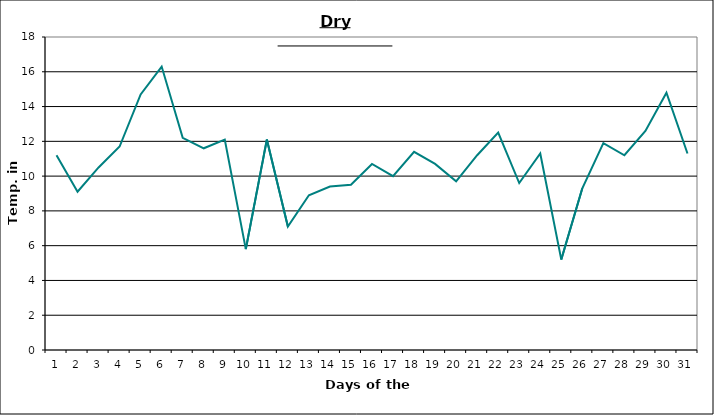
| Category | Series 0 |
|---|---|
| 0 | 11.2 |
| 1 | 9.1 |
| 2 | 10.5 |
| 3 | 11.7 |
| 4 | 14.7 |
| 5 | 16.3 |
| 6 | 12.2 |
| 7 | 11.6 |
| 8 | 12.1 |
| 9 | 5.8 |
| 10 | 12.1 |
| 11 | 7.1 |
| 12 | 8.9 |
| 13 | 9.4 |
| 14 | 9.5 |
| 15 | 10.7 |
| 16 | 10 |
| 17 | 11.4 |
| 18 | 10.7 |
| 19 | 9.7 |
| 20 | 11.2 |
| 21 | 12.5 |
| 22 | 9.6 |
| 23 | 11.3 |
| 24 | 5.2 |
| 25 | 9.3 |
| 26 | 11.9 |
| 27 | 11.2 |
| 28 | 12.6 |
| 29 | 14.8 |
| 30 | 11.3 |